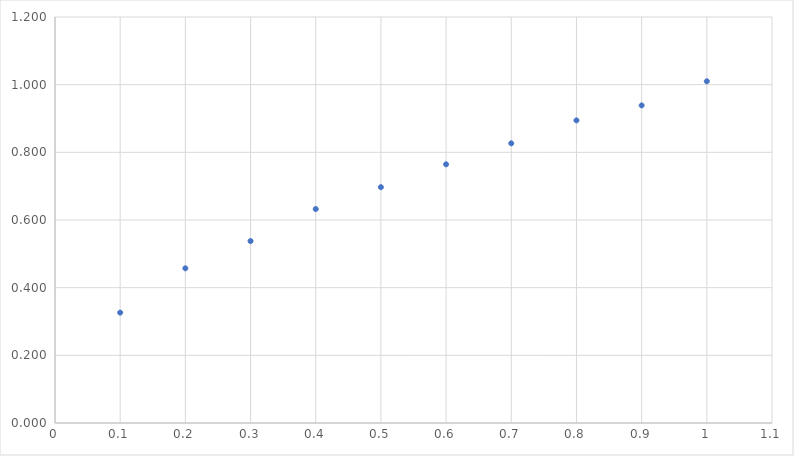
| Category | y |
|---|---|
| 0.1 | 0.326 |
| 0.2 | 0.457 |
| 0.30000000000000004 | 0.538 |
| 0.4 | 0.632 |
| 0.5 | 0.697 |
| 0.6 | 0.765 |
| 0.7 | 0.827 |
| 0.7999999999999999 | 0.894 |
| 0.8999999999999999 | 0.939 |
| 0.9999999999999999 | 1.01 |